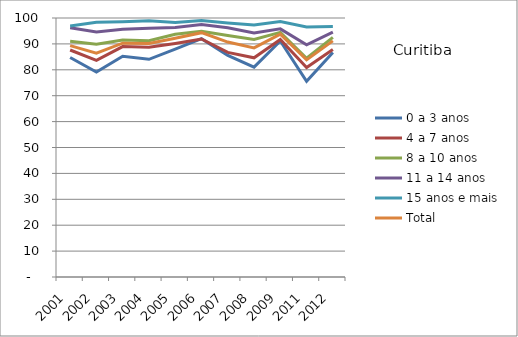
| Category | 0 a 3 anos | 4 a 7 anos | 8 a 10 anos | 11 a 14 anos | 15 anos e mais | Total |
|---|---|---|---|---|---|---|
| 2001.0 | 84.77 | 87.64 | 91.05 | 96.2 | 96.88 | 89.33 |
| 2002.0 | 79.12 | 83.61 | 89.89 | 94.56 | 98.38 | 86.44 |
| 2003.0 | 85.2 | 88.97 | 91.49 | 95.68 | 98.59 | 90.28 |
| 2004.0 | 84.05 | 88.69 | 91.25 | 96 | 98.89 | 90.2 |
| 2005.0 | 87.96 | 90.18 | 93.75 | 96.35 | 98.31 | 92.21 |
| 2006.0 | 92 | 91.89 | 94.84 | 97.47 | 99.05 | 94.34 |
| 2007.0 | 85.54 | 86.71 | 93.22 | 96.22 | 98.09 | 90.71 |
| 2008.0 | 81.04 | 84.63 | 91.68 | 94.19 | 97.31 | 88.44 |
| 2009.0 | 91.11 | 91.67 | 94.47 | 95.8 | 98.66 | 93.79 |
| 2011.0 | 75.53 | 80.92 | 84.48 | 89.63 | 96.56 | 83.83 |
| 2012.0 | 86.7 | 87.85 | 92.53 | 94.56 | 96.69 | 91.18 |